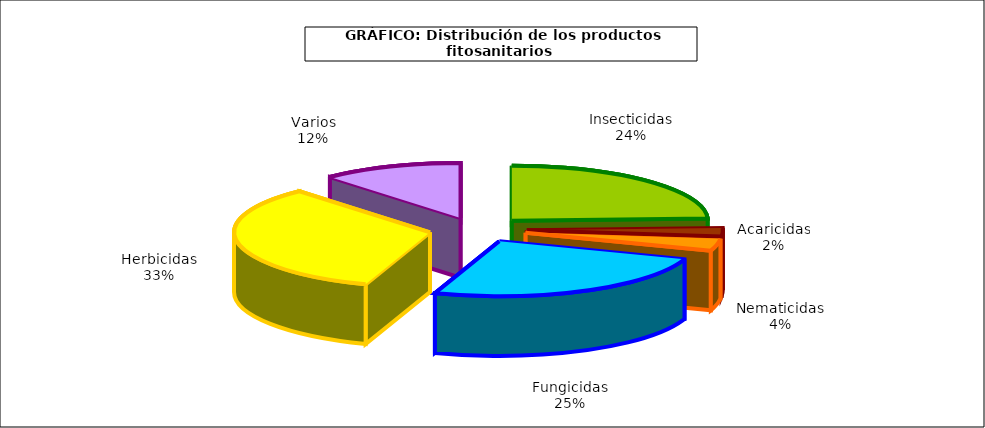
| Category | Insecticidas |
|---|---|
| Insecticidas | 349.131 |
| Acaricidas | 34.67 |
| Nematicidas | 50.828 |
| Fungicidas | 358.782 |
| Herbicidas | 474.271 |
| Varios | 166.425 |